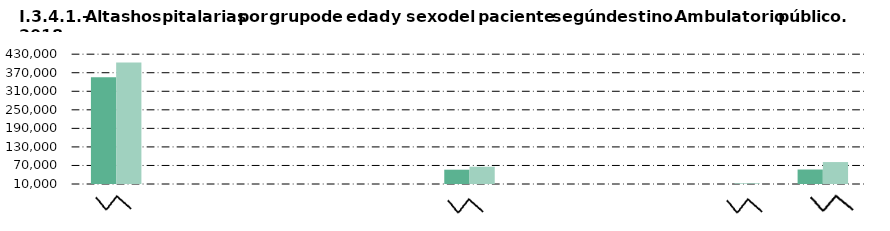
| Category |     Hombre |     Mujer |
|---|---|---|
| Alta médica | 355007 | 403421 |
| Alta voluntaria | 102 | 110 |
| Fallecimiento | 3 | 4 |
| Centro sociosanitario | 3 | 3 |
| Consulta hospitalaria | 56306 | 65824 |
| Urgencias | 90 | 125 |
| Cirugía ambulatoria | 1907 | 2284 |
| Atención primaria | 9769 | 12339 |
| No consta | 56859 | 80974 |